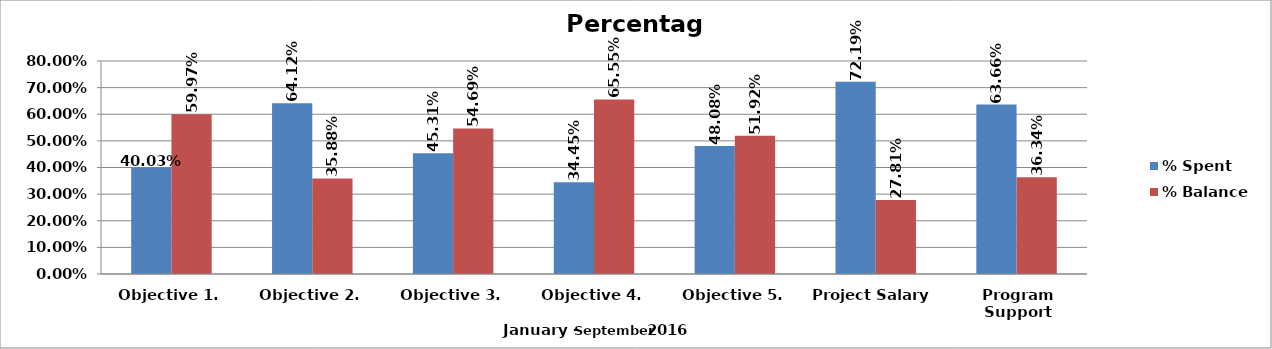
| Category | % Spent  | % Balance  |
|---|---|---|
| Objective 1. | 0.4 | 0.6 |
| Objective 2. | 0.641 | 0.359 |
| Objective 3. | 0.453 | 0.547 |
| Objective 4. | 0.344 | 0.656 |
| Objective 5. | 0.481 | 0.519 |
| Project Salary  | 0.722 | 0.278 |
| Program Support | 0.637 | 0.363 |